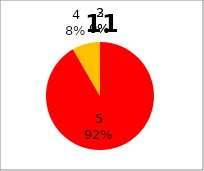
| Category | Series 0 |
|---|---|
| 5.0 | 11 |
| 4.0 | 1 |
| 3.0 | 0 |
| 2.0 | 0 |